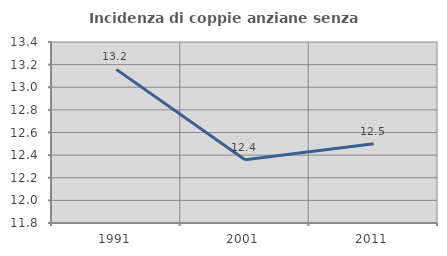
| Category | Incidenza di coppie anziane senza figli  |
|---|---|
| 1991.0 | 13.158 |
| 2001.0 | 12.36 |
| 2011.0 | 12.5 |